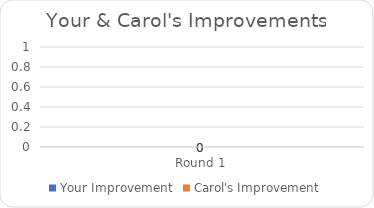
| Category | Your Improvement | Carol's Improvement |
|---|---|---|
| Round 1 | 0 | 0 |